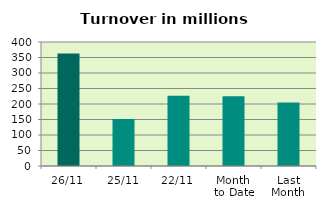
| Category | Series 0 |
|---|---|
| 26/11 | 363.18 |
| 25/11 | 151.398 |
| 22/11 | 226.422 |
| Month 
to Date | 224.733 |
| Last
Month | 204.729 |